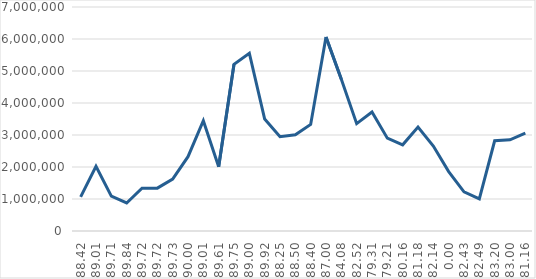
| Category | Series 3 |
|---|---|
| 88.42 | 1066374 |
| 89.01 | 2023272 |
| 89.71000000000001 | 1087061 |
| 89.84 | 876359 |
| 89.72 | 1339136 |
| 89.72 | 1339136 |
| 89.73 | 1621106 |
| 90.0 | 2321496 |
| 89.01 | 3445673 |
| 89.61 | 2010265 |
| 89.75 | 5210390 |
| 89.0 | 5556628 |
| 89.92 | 3499637 |
| 88.25 | 2945951 |
| 88.5 | 3007777 |
| 88.4 | 3328902 |
| 87.0 | 6061531 |
| 84.08 | 4742443 |
| 82.52 | 3354269 |
| 79.31 | 3717608 |
| 79.21000000000001 | 2900964 |
| 80.16 | 2692717 |
| 81.17999999999999 | 3249952 |
| 82.14 | 2653138 |
| 0.0 | 1855251 |
| 82.43 | 1224964 |
| 82.49000000000001 | 1001935 |
| 83.2 | 2819161 |
| 83.0 | 2850462 |
| 81.16 | 3061566 |